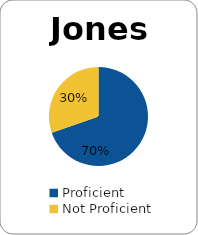
| Category | Series 0 |
|---|---|
| Proficient | 0.697 |
| Not Proficient | 0.303 |